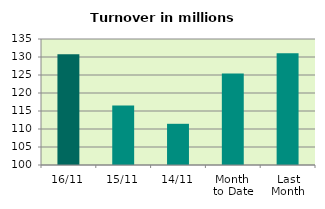
| Category | Series 0 |
|---|---|
| 16/11 | 130.759 |
| 15/11 | 116.534 |
| 14/11 | 111.443 |
| Month 
to Date | 125.431 |
| Last
Month | 131.017 |